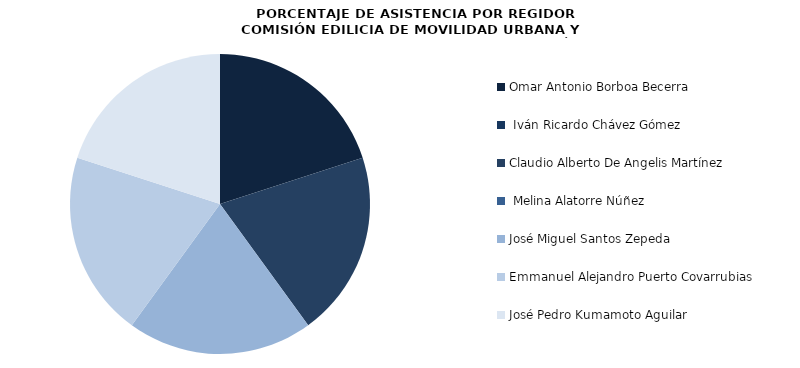
| Category | Series 0 |
|---|---|
| Omar Antonio Borboa Becerra | 100 |
|  Iván Ricardo Chávez Gómez | 0 |
| Claudio Alberto De Angelis Martínez | 100 |
|  Melina Alatorre Núñez | 0 |
| José Miguel Santos Zepeda | 100 |
| Emmanuel Alejandro Puerto Covarrubias | 100 |
| José Pedro Kumamoto Aguilar | 100 |